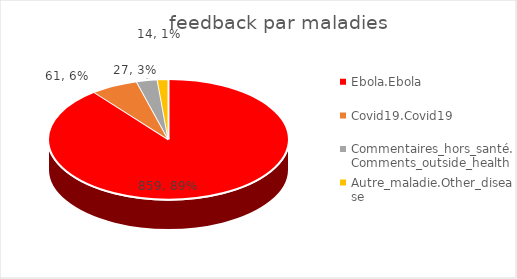
| Category | Somme de Nbre2 | $ |
|---|---|---|
| Ebola.Ebola | 859 | 0.894 |
| Covid19.Covid19 | 61 | 0.063 |
| Commentaires_hors_santé.Comments_outside_health | 27 | 0.028 |
| Autre_maladie.Other_disease | 14 | 0.015 |